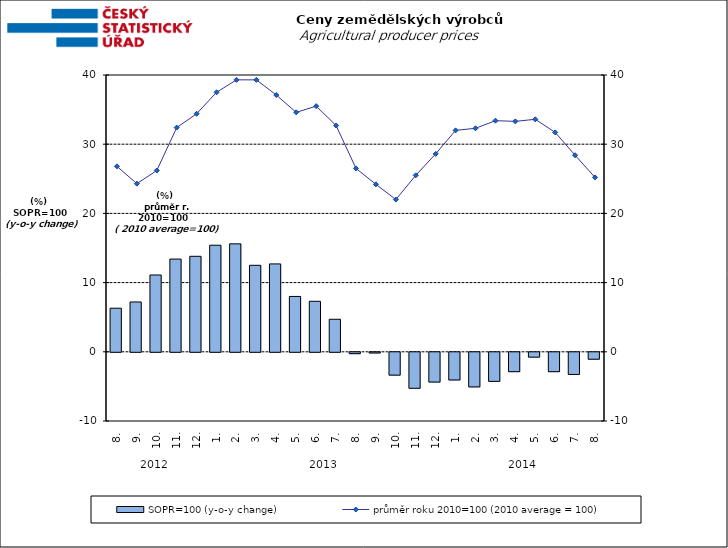
| Category | SOPR=100 (y-o-y change)   |
|---|---|
| 0 | 6.3 |
| 1 | 7.2 |
| 2 | 11.1 |
| 3 | 13.4 |
| 4 | 13.8 |
| 5 | 15.4 |
| 6 | 15.6 |
| 7 | 12.5 |
| 8 | 12.7 |
| 9 | 8 |
| 10 | 7.3 |
| 11 | 4.7 |
| 12 | -0.2 |
| 13 | -0.1 |
| 14 | -3.3 |
| 15 | -5.2 |
| 16 | -4.3 |
| 17 | -4 |
| 18 | -5 |
| 19 | -4.2 |
| 20 | -2.8 |
| 21 | -0.7 |
| 22 | -2.8 |
| 23 | -3.2 |
| 24 | -1 |